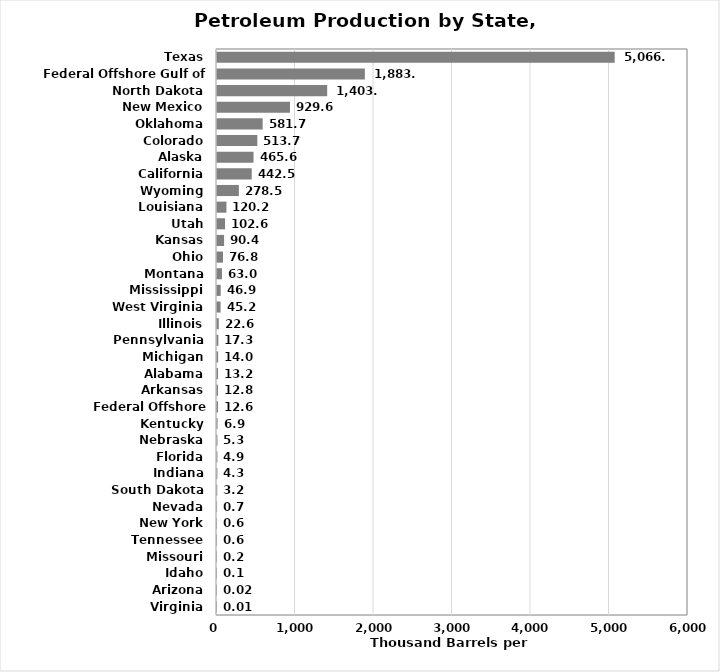
| Category | Series 0 |
|---|---|
| Virginia | 0.011 |
| Arizona | 0.019 |
| Idaho | 0.063 |
| Missouri | 0.225 |
| Tennessee | 0.551 |
| New York | 0.605 |
| Nevada | 0.715 |
| South Dakota | 3.189 |
| Indiana | 4.29 |
| Florida | 4.888 |
| Nebraska | 5.345 |
| Kentucky | 6.863 |
| Federal Offshore Alaska/Pacific | 12.608 |
| Arkansas | 12.759 |
| Alabama | 13.178 |
| Michigan | 14.022 |
| Pennsylvania | 17.323 |
| Illinois | 22.584 |
| West Virginia | 45.222 |
| Mississippi | 46.855 |
| Montana | 62.967 |
| Ohio | 76.792 |
| Kansas | 90.353 |
| Utah | 102.578 |
| Louisiana | 120.23 |
| Wyoming | 278.504 |
| California | 442.458 |
| Alaska | 465.608 |
| Colorado | 513.696 |
| Oklahoma | 581.658 |
| New Mexico | 929.619 |
| North Dakota | 1403.46 |
| Federal Offshore Gulf of Mexico | 1883.726 |
| Texas | 5066.225 |